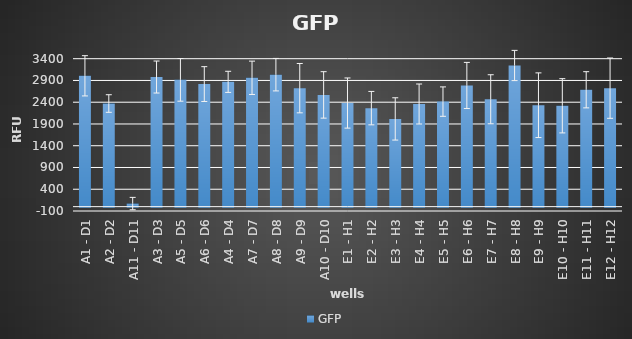
| Category | GFP |
|---|---|
| A1 - D1 | 3007 |
| A2 - D2 | 2370 |
| A11 - D11 | 71 |
| A3 - D3 | 2979 |
| A5 - D5 | 2914 |
| A6 - D6 | 2817 |
| A4 - D4 | 2868 |
| A7 - D7 | 2961 |
| A8 - D8 | 3033 |
| A9 - D9 | 2723 |
| A10 - D10 | 2568 |
| E1 - H1 | 2381 |
| E2 - H2 | 2264 |
| E3 - H3 | 2016 |
| E4 - H4 | 2359 |
| E5 - H5 | 2414 |
| E6 - H6 | 2785 |
| E7 - H7 | 2468 |
| E8 - H8 | 3244 |
| E9 - H9 | 2331 |
| E10 - H10 | 2318 |
| E11 - H11 | 2686 |
| E12 - H12 | 2723 |